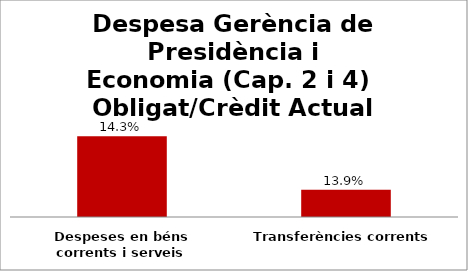
| Category | Series 0 |
|---|---|
| Despeses en béns corrents i serveis | 0.143 |
| Transferències corrents | 0.139 |